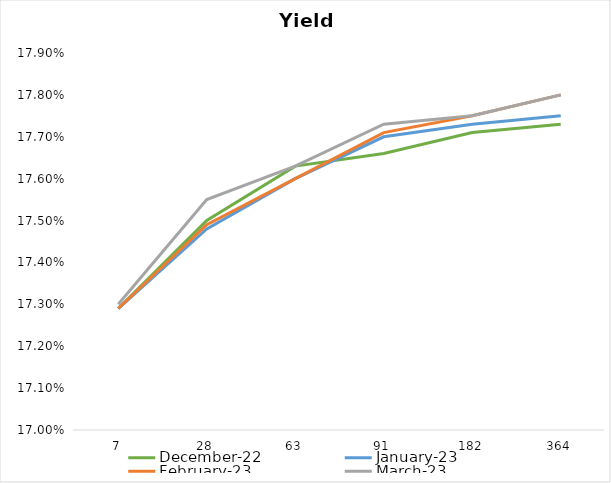
| Category | December-22 | January-23 | February-23  | March-23  |
|---|---|---|---|---|
| 7.0 | 0.173 | 0.173 | 0.173 | 0.173 |
| 28.0 | 0.175 | 0.175 | 0.175 | 0.176 |
| 63.0 | 0.176 | 0.176 | 0.176 | 0.176 |
| 91.0 | 0.177 | 0.177 | 0.177 | 0.177 |
| 182.0 | 0.177 | 0.177 | 0.178 | 0.178 |
| 364.0 | 0.177 | 0.178 | 0.178 | 0.178 |